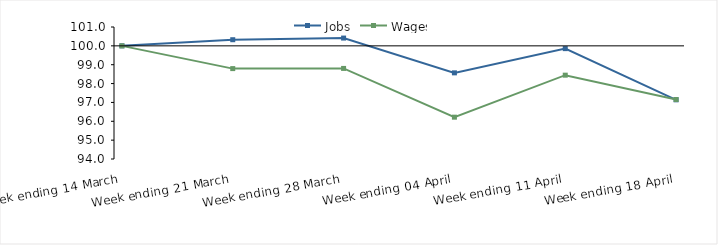
| Category | Jobs | Wages |
|---|---|---|
| 0 | 100 | 100 |
| 1900-01-01 | 100.326 | 98.794 |
| 1900-01-02 | 100.413 | 98.804 |
| 1900-01-03 | 98.568 | 96.218 |
| 1900-01-04 | 99.853 | 98.446 |
| 1900-01-05 | 97.139 | 97.156 |